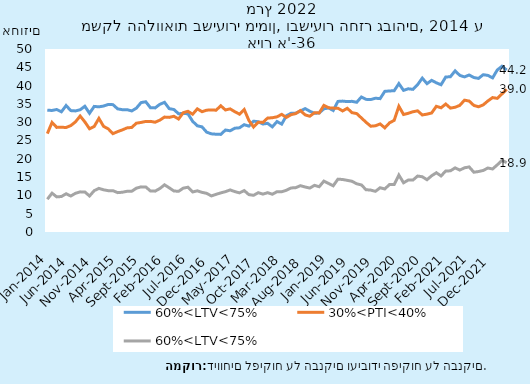
| Category | 60%<LTV<75% | 30%<PTI<40% | 60%<LTV<75% 
30%<PTI<40% |
|---|---|---|---|
| 2014-01-31 | 33.278 | 26.879 | 8.953 |
| 2014-02-28 | 33.207 | 29.936 | 10.607 |
| 2014-03-31 | 33.47 | 28.583 | 9.598 |
| 2014-04-30 | 32.84 | 28.623 | 9.696 |
| 2014-05-31 | 34.559 | 28.551 | 10.446 |
| 2014-06-30 | 33.165 | 29.073 | 9.835 |
| 2014-07-31 | 33.081 | 30.095 | 10.572 |
| 2014-08-31 | 33.4 | 31.685 | 10.965 |
| 2014-09-30 | 34.354 | 30.083 | 10.94 |
| 2014-10-31 | 32.442 | 28.207 | 9.838 |
| 2014-11-30 | 34.315 | 28.836 | 11.303 |
| 2014-12-31 | 34.195 | 31.038 | 11.916 |
| 2015-01-31 | 34.414 | 28.863 | 11.528 |
| 2015-02-28 | 34.86 | 28.172 | 11.29 |
| 2015-03-31 | 34.795 | 26.88 | 11.29 |
| 2015-04-30 | 33.645 | 27.429 | 10.756 |
| 2015-05-31 | 33.415 | 27.9 | 10.861 |
| 2015-06-30 | 33.429 | 28.448 | 11.12 |
| 2015-07-31 | 33.077 | 28.567 | 11.128 |
| 2015-08-31 | 33.843 | 29.731 | 11.977 |
| 2015-09-30 | 35.36 | 29.937 | 12.33 |
| 2015-10-31 | 35.585 | 30.211 | 12.303 |
| 2015-11-30 | 33.947 | 30.225 | 11.205 |
| 2015-12-31 | 33.91 | 29.996 | 11.165 |
| 2016-01-31 | 34.885 | 30.563 | 11.877 |
| 2016-02-29 | 35.431 | 31.398 | 12.888 |
| 2016-03-31 | 33.702 | 31.315 | 12.077 |
| 2016-04-30 | 33.464 | 31.624 | 11.211 |
| 2016-05-31 | 32.31 | 30.871 | 11.113 |
| 2016-06-30 | 32.421 | 32.601 | 11.984 |
| 2016-07-31 | 32.285 | 32.978 | 12.238 |
| 2016-08-31 | 30.241 | 32.176 | 10.936 |
| 2016-09-30 | 29.015 | 33.65 | 11.253 |
| 2016-10-31 | 28.726 | 32.87 | 10.832 |
| 2016-11-30 | 27.272 | 33.283 | 10.561 |
| 2016-12-31 | 26.82 | 33.365 | 9.859 |
| 2017-01-31 | 26.715 | 33.276 | 10.296 |
| 2017-02-28 | 26.667 | 34.486 | 10.682 |
| 2017-03-31 | 27.86 | 33.347 | 11.022 |
| 2017-04-30 | 27.652 | 33.641 | 11.494 |
| 2017-05-31 | 28.358 | 32.863 | 11.039 |
| 2017-06-30 | 28.466 | 32.199 | 10.69 |
| 2017-07-31 | 29.318 | 33.48 | 11.324 |
| 2017-08-31 | 28.926 | 30.484 | 10.209 |
| 2017-09-30 | 30.277 | 28.676 | 10.026 |
| 2017-10-31 | 30.132 | 30.009 | 10.74 |
| 2017-11-30 | 29.503 | 29.95 | 10.352 |
| 2017-12-31 | 29.684 | 31.132 | 10.74 |
| 2018-01-31 | 28.725 | 31.215 | 10.313 |
| 2018-02-28 | 30.173 | 31.467 | 11.01 |
| 2018-03-31 | 29.482 | 32.149 | 10.996 |
| 2018-04-30 | 31.744 | 31.308 | 11.404 |
| 2018-05-31 | 32.44 | 32.051 | 12.029 |
| 2018-06-30 | 32.483 | 32.357 | 12.12 |
| 2018-07-31 | 33.056 | 33.185 | 12.653 |
| 2018-08-31 | 33.715 | 31.999 | 12.295 |
| 2018-09-30 | 33.003 | 31.631 | 12.006 |
| 2018-10-31 | 32.427 | 32.604 | 12.744 |
| 2018-11-30 | 32.524 | 32.521 | 12.372 |
| 2018-12-31 | 33.651 | 34.588 | 13.9 |
| 2019-01-31 | 33.893 | 33.944 | 13.275 |
| 2019-02-28 | 33.201 | 33.849 | 12.634 |
| 2019-03-31 | 35.679 | 33.814 | 14.438 |
| 2019-04-30 | 35.765 | 33.079 | 14.345 |
| 2019-05-31 | 35.625 | 33.798 | 14.111 |
| 2019-06-30 | 35.702 | 32.601 | 13.862 |
| 2019-07-31 | 35.441 | 32.36 | 13.177 |
| 2019-08-31 | 36.877 | 31.171 | 12.855 |
| 2019-09-30 | 36.241 | 29.98 | 11.556 |
| 2019-10-31 | 36.185 | 28.903 | 11.448 |
| 2019-11-30 | 36.553 | 29.017 | 11.11 |
| 2019-12-31 | 36.441 | 29.531 | 12.093 |
| 2020-01-31 | 38.425 | 28.454 | 11.753 |
| 2020-02-29 | 38.538 | 29.817 | 12.976 |
| 2020-03-31 | 38.596 | 30.503 | 12.952 |
| 2020-04-30 | 40.544 | 34.351 | 15.565 |
| 2020-05-31 | 38.69 | 32.105 | 13.445 |
| 2020-06-30 | 39.13 | 32.423 | 14.196 |
| 2020-07-31 | 38.975 | 32.852 | 14.188 |
| 2020-08-31 | 40.26 | 33.104 | 15.288 |
| 2020-09-30 | 42.04 | 31.976 | 15.096 |
| 2020-10-31 | 40.533 | 32.201 | 14.284 |
| 2020-11-30 | 41.438 | 32.527 | 15.368 |
| 2020-12-31 | 40.76 | 34.345 | 16.19 |
| 2021-01-31 | 40.232 | 33.93 | 15.317 |
| 2021-02-28 | 42.34 | 34.966 | 16.657 |
| 2021-03-31 | 42.426 | 33.853 | 16.713 |
| 2021-04-30 | 44.022 | 34.08 | 17.522 |
| 2021-05-31 | 42.799 | 34.601 | 16.917 |
| 2021-06-30 | 42.374 | 36.015 | 17.539 |
| 2021-07-31 | 42.892 | 35.777 | 17.777 |
| 2021-08-31 | 42.205 | 34.587 | 16.336 |
| 2021-09-30 | 41.968 | 34.216 | 16.525 |
| 2021-10-31 | 42.978 | 34.735 | 16.821 |
| 2021-11-30 | 42.786 | 35.813 | 17.481 |
| 2021-12-31 | 42.108 | 36.724 | 17.221 |
| 2022-01-31 | 44.266 | 36.516 | 18.347 |
| 2022-02-28 | 45.289 | 37.726 | 19.605 |
| 2022-03-31 | 44.247 | 39.002 | 18.932 |